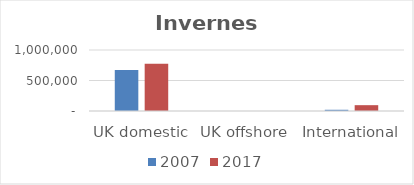
| Category | 2007 | 2017 |
|---|---|---|
| UK domestic | 673859 | 775395 |
| UK offshore | 17 | 47 |
| International | 20139 | 95579 |